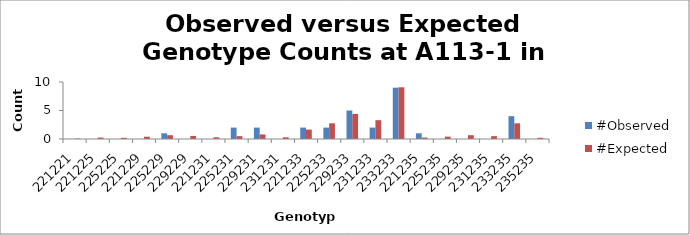
| Category | #Observed | #Expected |
|---|---|---|
| 221221.0 | 0 | 0.075 |
| 221225.0 | 0 | 0.25 |
| 225225.0 | 0 | 0.208 |
| 221229.0 | 0 | 0.4 |
| 225229.0 | 1 | 0.667 |
| 229229.0 | 0 | 0.533 |
| 221231.0 | 0 | 0.3 |
| 225231.0 | 2 | 0.5 |
| 229231.0 | 2 | 0.8 |
| 231231.0 | 0 | 0.3 |
| 221233.0 | 2 | 1.65 |
| 225233.0 | 2 | 2.75 |
| 229233.0 | 5 | 4.4 |
| 231233.0 | 2 | 3.3 |
| 233233.0 | 9 | 9.075 |
| 221235.0 | 1 | 0.25 |
| 225235.0 | 0 | 0.417 |
| 229235.0 | 0 | 0.667 |
| 231235.0 | 0 | 0.5 |
| 233235.0 | 4 | 2.75 |
| 235235.0 | 0 | 0.208 |